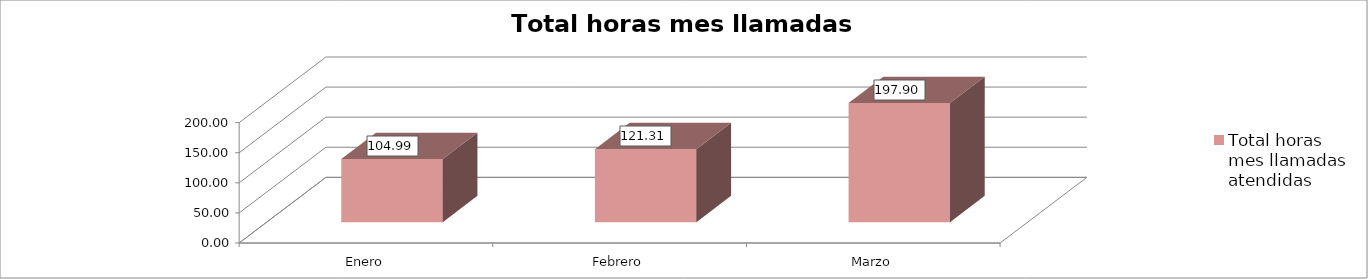
| Category | Total horas mes llamadas atendidas |
|---|---|
| Enero | 104.99 |
| Febrero | 121.31 |
| Marzo | 197.9 |